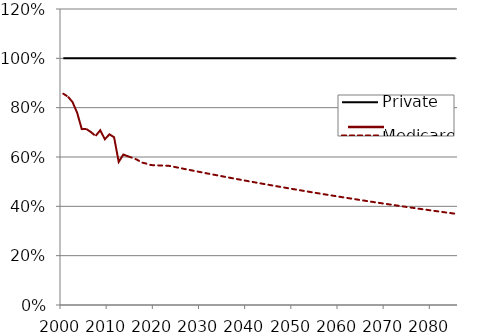
| Category | Private | Medicare |
|---|---|---|
| 2000.0 | 1 | 0.857 |
| 2001.0 | 1 | 0.845 |
| 2002.0 | 1 | 0.823 |
| 2003.0 | 1 | 0.779 |
| 2004.0 | 1 | 0.713 |
| 2005.0 | 1 | 0.713 |
| 2006.0 | 1 | 0.701 |
| 2007.0 | 1 | 0.685 |
| 2008.0 | 1 | 0.708 |
| 2009.0 | 1 | 0.672 |
| 2010.0 | 1 | 0.692 |
| 2011.0 | 1 | 0.68 |
| 2012.0 | 1 | 0.58 |
| 2013.0 | 1 | 0.61 |
| 2014.0 | 1 | 0.603 |
| 2015.0 | 1 | 0.596 |
| 2016.0 | 1 | 0.589 |
| 2017.0 | 1 | 0.578 |
| 2018.0 | 1 | 0.573 |
| 2019.0 | 1 | 0.567 |
| 2020.0 | 1 | 0.567 |
| 2021.0 | 1 | 0.566 |
| 2022.0 | 1 | 0.565 |
| 2023.0 | 1 | 0.564 |
| 2024.0 | 1 | 0.56 |
| 2025.0 | 1 | 0.556 |
| 2026.0 | 1 | 0.553 |
| 2027.0 | 1 | 0.549 |
| 2028.0 | 1 | 0.545 |
| 2029.0 | 1 | 0.541 |
| 2030.0 | 1 | 0.538 |
| 2031.0 | 1 | 0.534 |
| 2032.0 | 1 | 0.53 |
| 2033.0 | 1 | 0.527 |
| 2034.0 | 1 | 0.523 |
| 2035.0 | 1 | 0.52 |
| 2036.0 | 1 | 0.516 |
| 2037.0 | 1 | 0.513 |
| 2038.0 | 1 | 0.509 |
| 2039.0 | 1 | 0.506 |
| 2040.0 | 1 | 0.502 |
| 2041.0 | 1 | 0.499 |
| 2042.0 | 1 | 0.496 |
| 2043.0 | 1 | 0.492 |
| 2044.0 | 1 | 0.489 |
| 2045.0 | 1 | 0.485 |
| 2046.0 | 1 | 0.482 |
| 2047.0 | 1 | 0.479 |
| 2048.0 | 1 | 0.476 |
| 2049.0 | 1 | 0.472 |
| 2050.0 | 1 | 0.469 |
| 2051.0 | 1 | 0.466 |
| 2052.0 | 1 | 0.463 |
| 2053.0 | 1 | 0.46 |
| 2054.0 | 1 | 0.457 |
| 2055.0 | 1 | 0.454 |
| 2056.0 | 1 | 0.45 |
| 2057.0 | 1 | 0.447 |
| 2058.0 | 1 | 0.444 |
| 2059.0 | 1 | 0.441 |
| 2060.0 | 1 | 0.438 |
| 2061.0 | 1 | 0.435 |
| 2062.0 | 1 | 0.432 |
| 2063.0 | 1 | 0.43 |
| 2064.0 | 1 | 0.427 |
| 2065.0 | 1 | 0.424 |
| 2066.0 | 1 | 0.421 |
| 2067.0 | 1 | 0.418 |
| 2068.0 | 1 | 0.415 |
| 2069.0 | 1 | 0.412 |
| 2070.0 | 1 | 0.41 |
| 2071.0 | 1 | 0.407 |
| 2072.0 | 1 | 0.404 |
| 2073.0 | 1 | 0.401 |
| 2074.0 | 1 | 0.399 |
| 2075.0 | 1 | 0.396 |
| 2076.0 | 1 | 0.393 |
| 2077.0 | 1 | 0.39 |
| 2078.0 | 1 | 0.388 |
| 2079.0 | 1 | 0.385 |
| 2080.0 | 1 | 0.383 |
| 2081.0 | 1 | 0.38 |
| 2082.0 | 1 | 0.377 |
| 2083.0 | 1 | 0.375 |
| 2084.0 | 1 | 0.372 |
| 2085.0 | 1 | 0.37 |